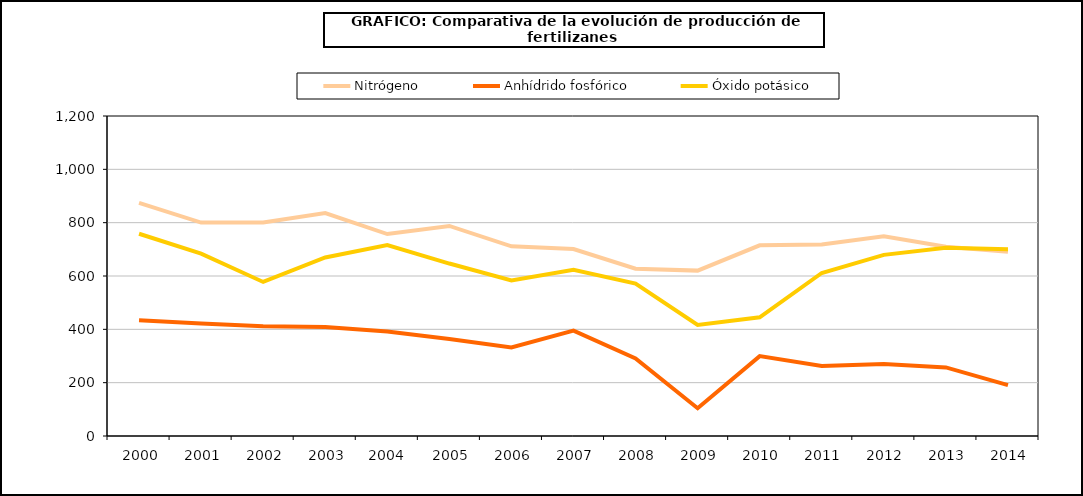
| Category | Nitrógeno | Anhídrido fosfórico | Óxido potásico |
|---|---|---|---|
|   2000 | 874.2 | 434.2 | 758.4 |
|   2001 | 800.4 | 421.9 | 684.1 |
|   2002 | 800.5 | 411.4 | 577.7 |
|   2003 | 835.9 | 409.1 | 669.6 |
|   2004  | 757.2 | 391.6 | 715.7 |
|   2005 | 787.7 | 363.889 | 646.714 |
|   2006 | 711.4 | 331.7 | 583.6 |
|   2007 | 701.022 | 394.992 | 623.095 |
|   2008 | 627.3 | 291.1 | 571.7 |
|   2009 | 620.2 | 104.3 | 416.7 |
|   2010 | 715 | 299.5 | 445.3 |
|   2011 | 718.1 | 262.6 | 611.3 |
|   2012 | 748.9 | 269.7 | 679.2 |
|   2013 | 710 | 257.1 | 706.3 |
|   2014 | 691.1 | 190.6 | 700 |